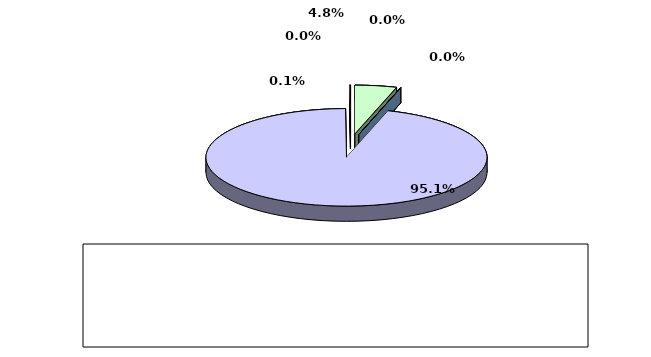
| Category | Series 0 |
|---|---|
| מזומנים ושווי מזומנים | 0.048 |
| אג"ח ממשלתיות סחירות | 0 |
| אג"ח קונצרני סחיר | 0 |
| ני"ע אחרים סחירים | 0.951 |
| פקדונות והלוואות | 0 |
| השקעות אחרות | 0.001 |